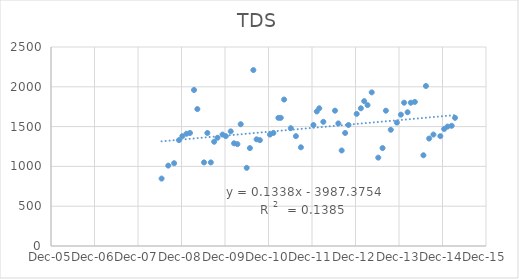
| Category | Series 0 |
|---|---|
| 39618.0 | 847 |
| 39674.0 | 1010 |
| 39723.0 | 1040 |
| 39764.0 | 1330 |
| 39792.0 | 1380 |
| 39827.0 | 1410 |
| 39856.0 | 1420 |
| 39890.0 | 1960 |
| 39918.0 | 1720 |
| 39974.0 | 1050 |
| 40002.0 | 1420 |
| 40031.0 | 1050 |
| 40059.0 | 1310 |
| 40087.0 | 1360 |
| 40129.0 | 1400 |
| 40157.0 | 1380 |
| 40198.0 | 1440 |
| 40226.0 | 1290 |
| 40282.0 | 1530 |
| 40254.0 | 1280 |
| 40332.0 | 982 |
| 40359.0 | 1230 |
| 40388.0 | 2210 |
| 40415.0 | 1340 |
| 40443.0 | 1330 |
| 40527.0 | 1400 |
| 40556.0 | 1420 |
| 40598.0 | 1610 |
| 40618.0 | 1610 |
| 40646.0 | 1840 |
| 40702.0 | 1480 |
| 40745.0 | 1380 |
| 40787.0 | 1240 |
| 40892.0 | 1520 |
| 40920.0 | 1690 |
| 40941.0 | 1730 |
| 40975.0 | 1560 |
| 41073.0 | 1700 |
| 41101.0 | 1540 |
| 41129.0 | 1200 |
| 41158.0 | 1420 |
| 41186.0 | 1520 |
| 41255.0 | 1660 |
| 41290.0 | 1730 |
| 41318.0 | 1820 |
| 41346.0 | 1770 |
| 41381.0 | 1930 |
| 41436.0 | 1110 |
| 41472.0 | 1230 |
| 41500.0 | 1700 |
| 41541.0 | 1460 |
| 41592.0 | 1550 |
| 41626.0 | 1650 |
| 41653.0 | 1800 |
| 41682.0 | 1680 |
| 41709.0 | 1800 |
| 41743.0 | 1810 |
| 41815.0 | 1140 |
| 41836.0 | 2010 |
| 41863.0 | 1350 |
| 41899.0 | 1400 |
| 41957.0 | 1380 |
| 41989.0 | 1470 |
| 42017.0 | 1500 |
| 42052.0 | 1510 |
| 42080.0 | 1610 |